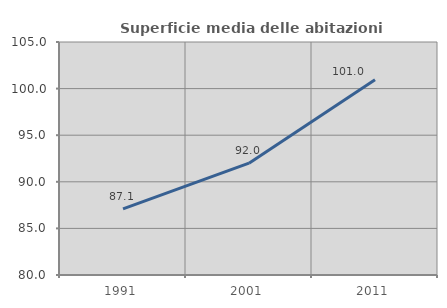
| Category | Superficie media delle abitazioni occupate |
|---|---|
| 1991.0 | 87.092 |
| 2001.0 | 92 |
| 2011.0 | 100.962 |